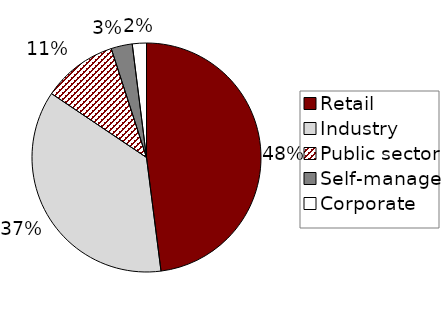
| Category | Series 0 |
|---|---|
| Retail | 0.481 |
| Industry | 0.366 |
| Public sector | 0.106 |
| Self-managed | 0.03 |
| Corporate | 0.02 |